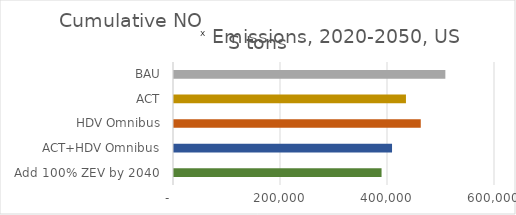
| Category | Cumulative NOx Emissions, 2020-2050, US tons |
|---|---|
|  Add 100% ZEV by 2040  | 387957.203 |
| ACT+HDV Omnibus | 407540 |
| HDV Omnibus | 461240 |
| ACT | 433550 |
| BAU | 507220 |